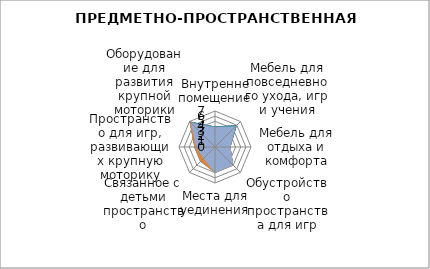
| Category | Series 0 | Series 1 | Series 2 | Series 3 | Series 4 | Series 5 | Series 6 |
|---|---|---|---|---|---|---|---|
| Внутренне помещение | 4 | 4 | 4 | 4 | 4 | 3 | 3.833 |
| Мебель для повседневного ухода, игр и учения | 6 | 6 | 6 | 6 | 6 | 4 | 5.667 |
| Мебель для отдыха и комфорта | 3 | 3 | 3 | 3 | 3 | 3 | 3 |
| Обустройство пространства для игр | 5 | 5 | 5 | 5 | 5 | 5 | 5 |
| Места для уединения | 5 | 5 | 5 | 5 | 5 | 5 | 5 |
| Связанное с детьми пространство | 4 | 1 | 4 | 2 | 4 | 4 | 3.167 |
| Пространство для игр, развивающих крупную моторику | 3 | 3 | 4 | 4 | 4 | 4 | 3.667 |
| Оборудование для развития крупной моторики | 7 | 5 | 7 | 7 | 7 | 7 | 6.667 |